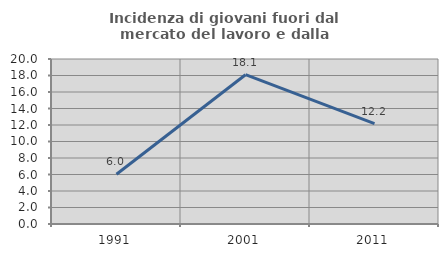
| Category | Incidenza di giovani fuori dal mercato del lavoro e dalla formazione  |
|---|---|
| 1991.0 | 6.034 |
| 2001.0 | 18.095 |
| 2011.0 | 12.174 |